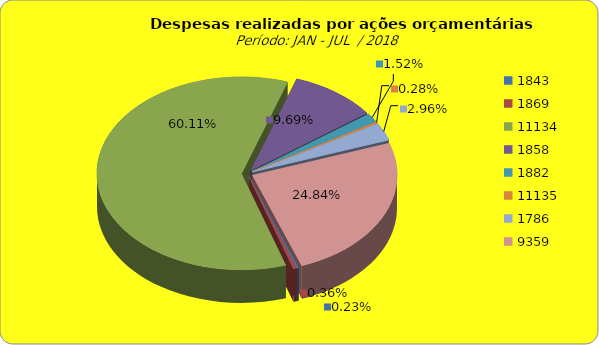
| Category | Series 1 |
|---|---|
| 1843.0 | 377866.03 |
| 1869.0 | 578242.06 |
| 11134.0 | 97211463.3 |
| 1858.0 | 15672503.22 |
| 1882.0 | 2457879.68 |
| 11135.0 | 460714.71 |
| 1786.0 | 4792295.63 |
| 9359.0 | 40164393.63 |